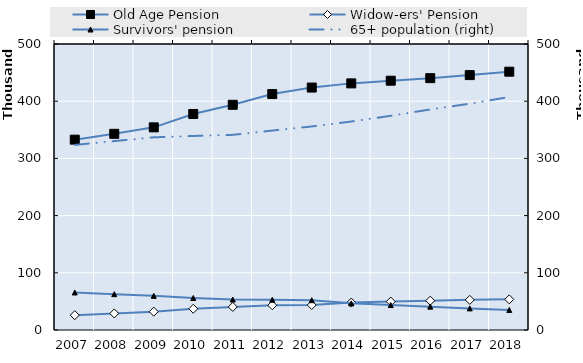
| Category | Old Age Pension | Widow-ers' Pension | Series 4 | Series 5 | Series 6 | Series 7 | Series 8 | Series 9 | Series 10 | Series 11 | Series 12 | Series 13 | Series 14 | Series 15 | Series 16 | Series 17 | Series 18 | Series 19 |
|---|---|---|---|---|---|---|---|---|---|---|---|---|---|---|---|---|---|---|
| 2007.0 | 332780 | 25913 |  |  |  |  |  |  |  |  |  |  |  |  |  |  |  |  |
| 2008.0 | 342992 | 28928 |  |  |  |  |  |  |  |  |  |  |  |  |  |  |  |  |
| 2009.0 | 354270 | 32119 |  |  |  |  |  |  |  |  |  |  |  |  |  |  |  |  |
| 2010.0 | 377604 | 37092 |  |  |  |  |  |  |  |  |  |  |  |  |  |  |  |  |
| 2011.0 | 393718 | 40348 |  |  |  |  |  |  |  |  |  |  |  |  |  |  |  |  |
| 2012.0 | 412474 | 43259 |  |  |  |  |  |  |  |  |  |  |  |  |  |  |  |  |
| 2013.0 | 423846 | 43690 |  |  |  |  |  |  |  |  |  |  |  |  |  |  |  |  |
| 2014.0 | 431158 | 47943 |  |  |  |  |  |  |  |  |  |  |  |  |  |  |  |  |
| 2015.0 | 435828 | 49685 |  |  |  |  |  |  |  |  |  |  |  |  |  |  |  |  |
| 2016.0 | 440277 | 51273 |  |  |  |  |  |  |  |  |  |  |  |  |  |  |  |  |
| 2017.0 | 445614 | 52670 |  |  |  |  |  |  |  |  |  |  |  |  |  |  |  |  |
| 2018.0 | 451584 | 53558 |  |  |  |  |  |  |  |  |  |  |  |  |  |  |  |  |